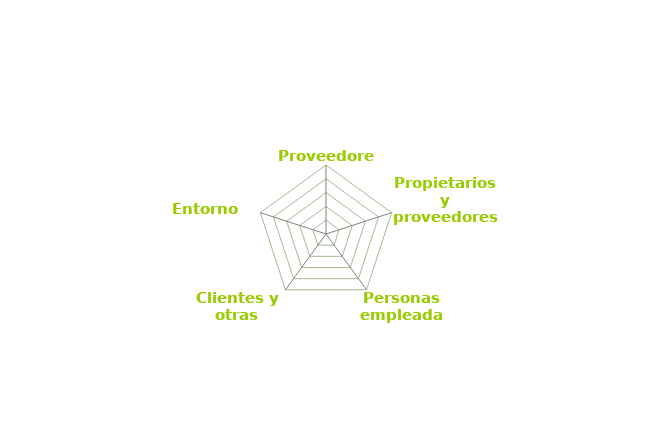
| Category | Series 0 |
|---|---|
| Proveedores | 0 |
| Propietarios y proveedores financieros | 0 |
| Personas empleadas | 0 |
| Clientes y otras organizaciones | 0 |
| Entorno social | 0 |